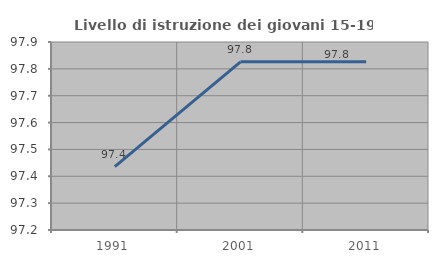
| Category | Livello di istruzione dei giovani 15-19 anni |
|---|---|
| 1991.0 | 97.436 |
| 2001.0 | 97.826 |
| 2011.0 | 97.826 |